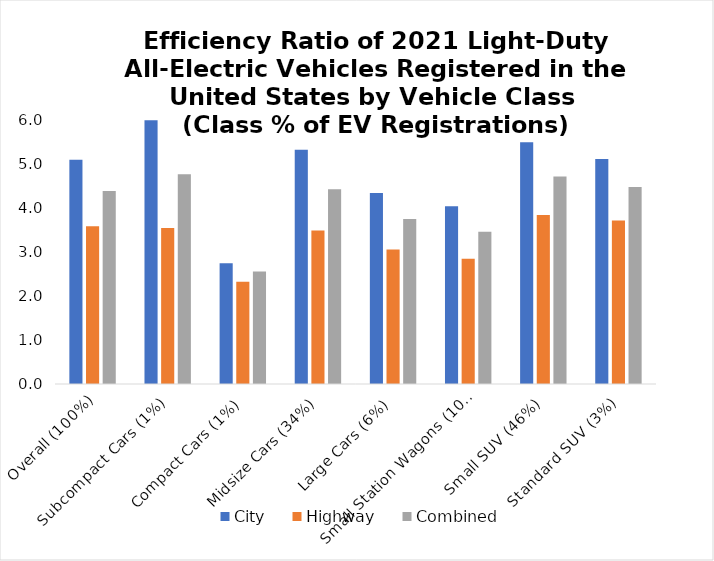
| Category | City | Highway | Combined |
|---|---|---|---|
| Overall (100%) | 5.099 | 3.583 | 4.384 |
| Subcompact Cars (1%) | 5.992 | 3.543 | 4.77 |
| Compact Cars (1%) | 2.743 | 2.324 | 2.557 |
| Midsize Cars (34%) | 5.326 | 3.488 | 4.429 |
| Large Cars (6%) | 4.34 | 3.06 | 3.749 |
| Small Station Wagons (10%) | 4.037 | 2.848 | 3.458 |
| Small SUV (46%) | 5.492 | 3.843 | 4.714 |
| Standard SUV (3%) | 5.116 | 3.716 | 4.476 |